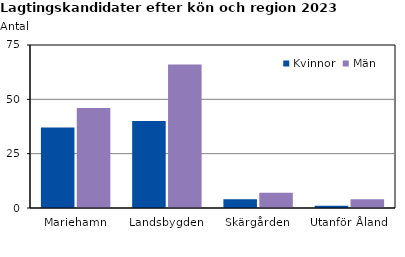
| Category | Kvinnor | Män |
|---|---|---|
| Mariehamn | 37 | 46 |
| Landsbygden | 40 | 66 |
| Skärgården | 4 | 7 |
| Utanför Åland | 1 | 4 |